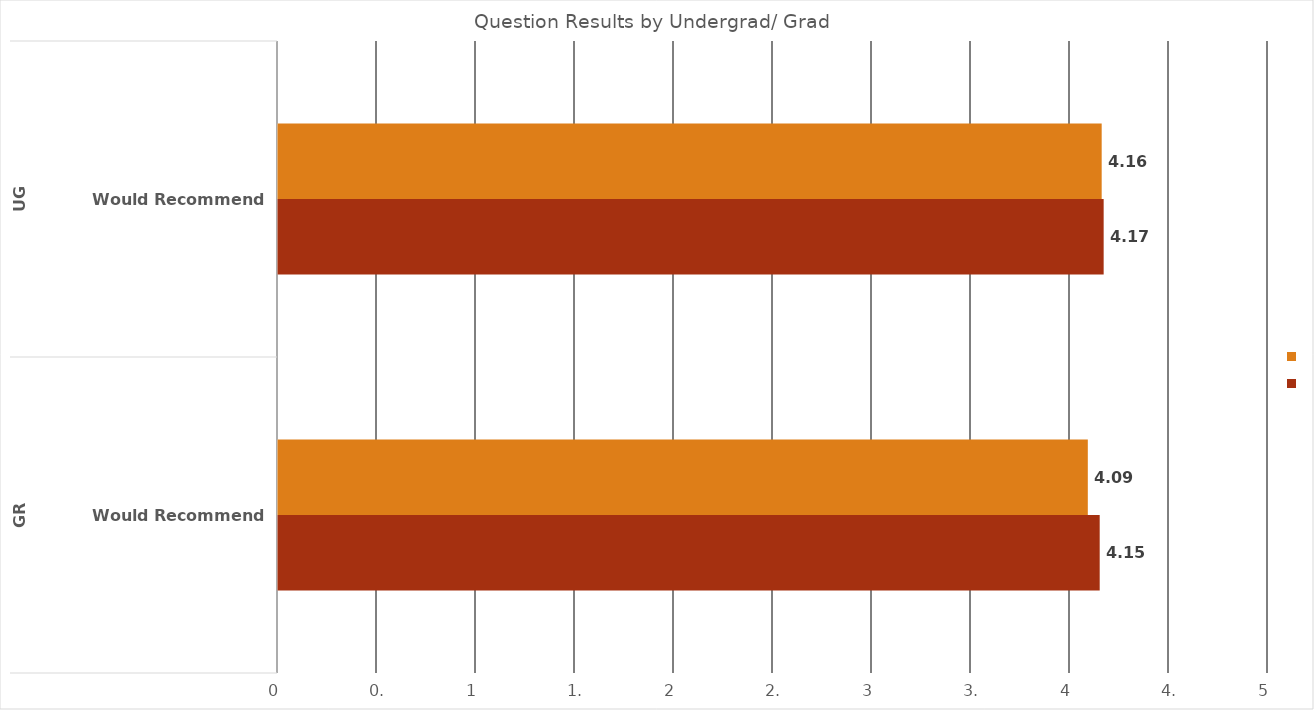
| Category | Spring 2015 | Fall 2015 |
|---|---|---|
| 0 | 4.15 | 4.09 |
| 1 | 4.17 | 4.16 |